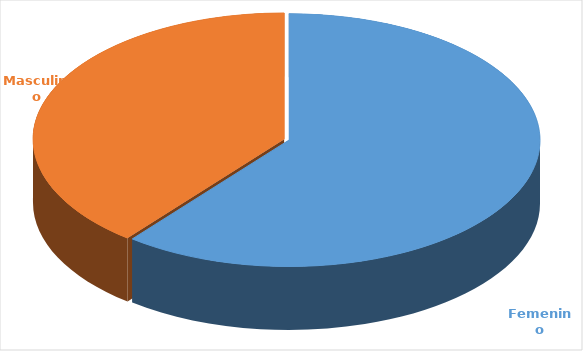
| Category | Cantidad  |
|---|---|
| Femenino | 3542 |
| Masculino | 2292 |